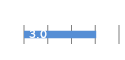
| Category | Series 0 |
|---|---|
| 0 | 3.04 |